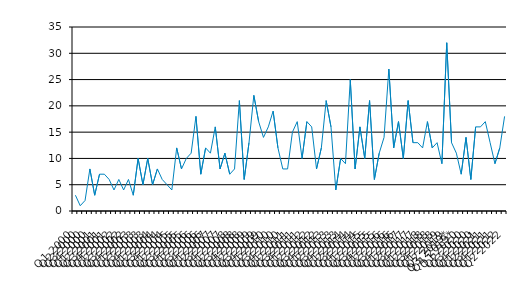
| Category | Series 0 |
|---|---|
| Q1 2000 | 3 |
| Q2 2000 | 1 |
| Q3 2000 | 2 |
| Q4 2000 | 8 |
| Q1 2001 | 3 |
| Q2 2001 | 7 |
| Q3 2001 | 7 |
| Q4 2001 | 6 |
| Q1 2002 | 4 |
| Q2 2002 | 6 |
| Q3 2002 | 4 |
| Q4 2002 | 6 |
| Q1 2003 | 3 |
| Q2 2003 | 10 |
| Q3 2003 | 5 |
| Q4 2003 | 10 |
| Q1 2004 | 5 |
| Q2 2004 | 8 |
| Q3 2004 | 6 |
| Q4 2004 | 5 |
| Q1 2005 | 4 |
| Q2 2005 | 12 |
| Q3 2005 | 8 |
| Q4 2005 | 10 |
| Q1 2006 | 11 |
| Q2 2006 | 18 |
| Q3 2006 | 7 |
| Q4 2006 | 12 |
| Q1 2007 | 11 |
| Q2 2007 | 16 |
| Q3 2007 | 8 |
| Q4 2007 | 11 |
| Q1 2008 | 7 |
| Q2 2008 | 8 |
| Q3 2008 | 21 |
| Q4 2008 | 6 |
| Q1 2009 | 13 |
| Q2 2009 | 22 |
| Q3 2009 | 17 |
| Q4 2009 | 14 |
| Q1 2010 | 16 |
| Q2 2010 | 19 |
| Q3 2010 | 12 |
| Q4 2010 | 8 |
| Q1 2011 | 8 |
| Q2 2011 | 15 |
| Q3 2011 | 17 |
| Q4 2011 | 10 |
| Q1 2012 | 17 |
| Q2 2012 | 16 |
| Q3 2012 | 8 |
| Q4 2012 | 12 |
| Q1 2013 | 21 |
| Q2 2013 | 16 |
| Q3 2013 | 4 |
| Q4 2013 | 10 |
| Q1 2014 | 9 |
| Q2 2014 | 25 |
| Q3 2014 | 8 |
| Q4 2014 | 16 |
| Q1 2015 | 10 |
| Q2 2015 | 21 |
| Q3 2015 | 6 |
| Q4 2015 | 11 |
| Q1 2016 | 14 |
| Q2 2016 | 27 |
| Q3 2016 | 12 |
| Q4 2016 | 17 |
| Q1 2017 | 10 |
| Q2 2017 | 21 |
| Q3 2017 | 13 |
| Q4 2017 | 13 |
| Q1 2018 | 12 |
| Q2 2018 | 17 |
| Q3 2018 | 12 |
| Q4 2018 | 13 |
| Q1 2019 | 9 |
| Q2 2019 | 32 |
| Q3 2019* | 13 |
| Q4 2019* | 11 |
| Q1 2020 | 7 |
| Q2 2020 | 14 |
| Q3 2020 | 6 |
| Q4 2020 | 16 |
| Q1 2021 | 16 |
| Q2 2021 | 17 |
| Q3 2021 | 13 |
| Q4 2021 | 9 |
| Q1 2022 | 12 |
| Q2 2022 | 18 |